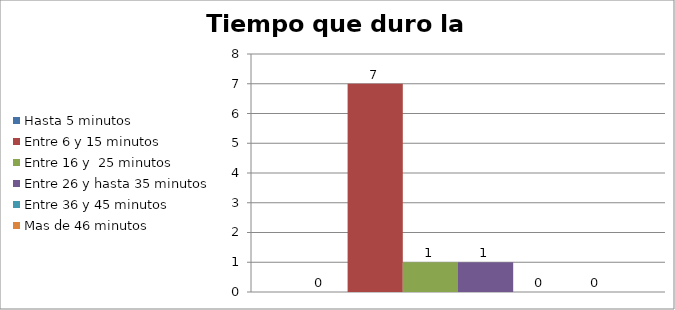
| Category | Hasta 5 minutos | Entre 6 y 15 minutos  | Entre 16 y  25 minutos | Entre 26 y hasta 35 minutos | Entre 36 y 45 minutos  | Mas de 46 minutos |
|---|---|---|---|---|---|---|
| 0 | 0 | 7 | 1 | 1 | 0 | 0 |